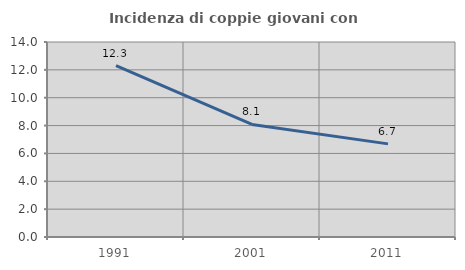
| Category | Incidenza di coppie giovani con figli |
|---|---|
| 1991.0 | 12.301 |
| 2001.0 | 8.083 |
| 2011.0 | 6.686 |